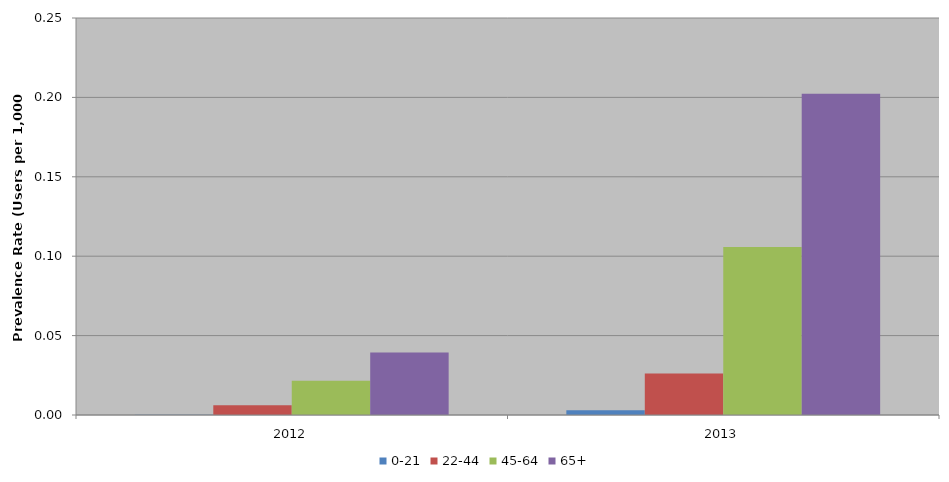
| Category | 0-21 | 22-44 | 45-64 | 65+ |
|---|---|---|---|---|
| 2012 | 0 | 0.006 | 0.022 | 0.039 |
| 2013 | 0.003 | 0.026 | 0.106 | 0.202 |